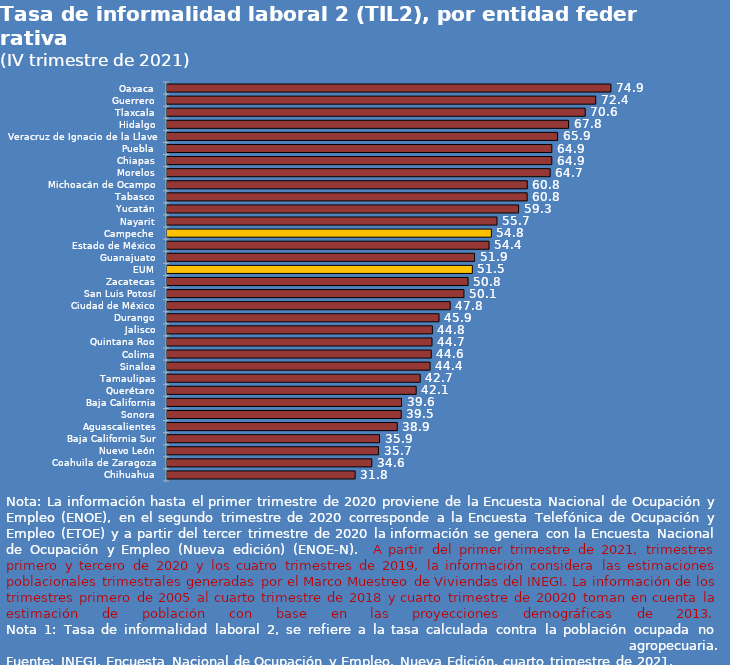
| Category | Series 0 |
|---|---|
| Oaxaca | 74.922 |
| Guerrero | 72.358 |
| Tlaxcala | 70.576 |
| Hidalgo | 67.779 |
| Veracruz de Ignacio de la Llave | 65.912 |
| Puebla | 64.949 |
| Chiapas | 64.947 |
| Morelos | 64.669 |
| Michoacán de Ocampo | 60.805 |
| Tabasco | 60.791 |
| Yucatán | 59.34 |
| Nayarit | 55.689 |
| Campeche | 54.75 |
| Estado de México | 54.353 |
| Guanajuato | 51.902 |
| EUM | 51.533 |
| Zacatecas | 50.824 |
| San Luis Potosí | 50.118 |
| Ciudad de México | 47.793 |
| Durango | 45.907 |
| Jalisco | 44.787 |
| Quintana Roo | 44.727 |
| Colima | 44.599 |
| Sinaloa | 44.404 |
| Tamaulipas | 42.733 |
| Querétaro | 42.059 |
| Baja California | 39.58 |
| Sonora | 39.535 |
| Aguascalientes | 38.866 |
| Baja California Sur | 35.868 |
| Nuevo León | 35.704 |
| Coahuila de Zaragoza | 34.563 |
| Chihuahua | 31.756 |